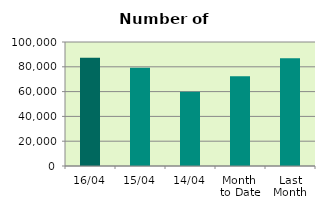
| Category | Series 0 |
|---|---|
| 16/04 | 87296 |
| 15/04 | 79228 |
| 14/04 | 59936 |
| Month 
to Date | 72457.4 |
| Last
Month | 86968.783 |